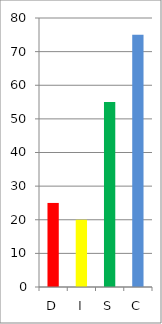
| Category | Series 0 |
|---|---|
| D | 25 |
| I | 20 |
| S | 55 |
| C | 75 |